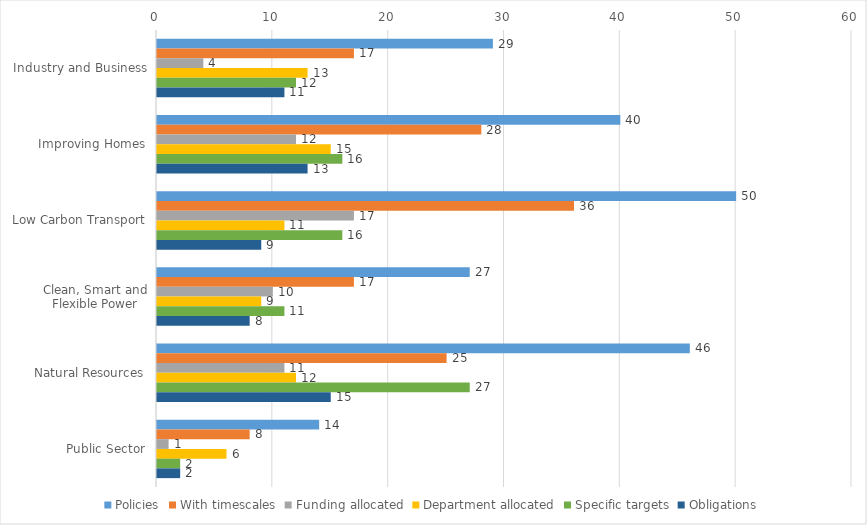
| Category | Policies | With timescales | Funding allocated | Department allocated | Specific targets | Obligations |
|---|---|---|---|---|---|---|
| Industry and Business | 29 | 17 | 4 | 13 | 12 | 11 |
| Improving Homes | 40 | 28 | 12 | 15 | 16 | 13 |
| Low Carbon Transport | 50 | 36 | 17 | 11 | 16 | 9 |
| Clean, Smart and Flexible Power | 27 | 17 | 10 | 9 | 11 | 8 |
| Natural Resources | 46 | 25 | 11 | 12 | 27 | 15 |
| Public Sector | 14 | 8 | 1 | 6 | 2 | 2 |